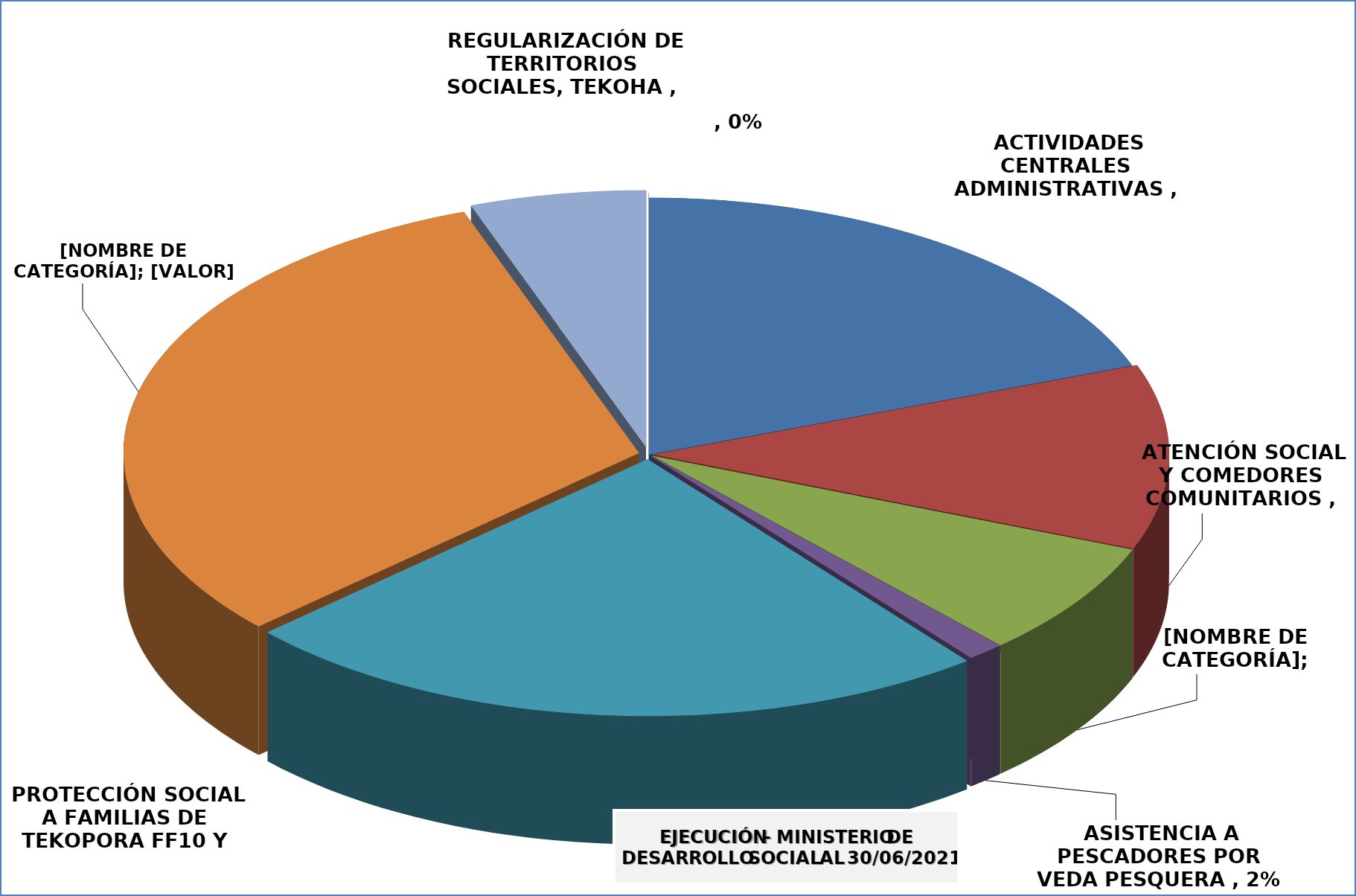
| Category | EJECUCIÓN - MINISTERIO DE DESARROLLO SOCIAL |
|---|---|
| ACTIVIDADES CENTRALES ADMINISTRATIVAS | 0.397 |
| ATENCIÓN SOCIAL Y COMEDORES COMUNITARIOS | 0.238 |
| ATENCIÓN SOCIAL Y COMEDORES COMUNITARIOS - OLLAS POPULARES -FF20 - OF 817 - COVID19 - ADICIONAL | 0.149 |
| ASISTENCIA A PESCADORES POR VEDA PESQUERA | 0.024 |
| PROTECCIÓN SOCIAL A FAMILIAS DE TEKOPORA FF10 Y FF20 | 0.488 |
| FOMENTO DE MICROEMPRENDIMIENTOS A PARTICIPANTES DE TENONDERA | 0.641 |
| REGULARIZACIÓN DE TERRITORIOS SOCIALES, TEKOHA | 0.113 |